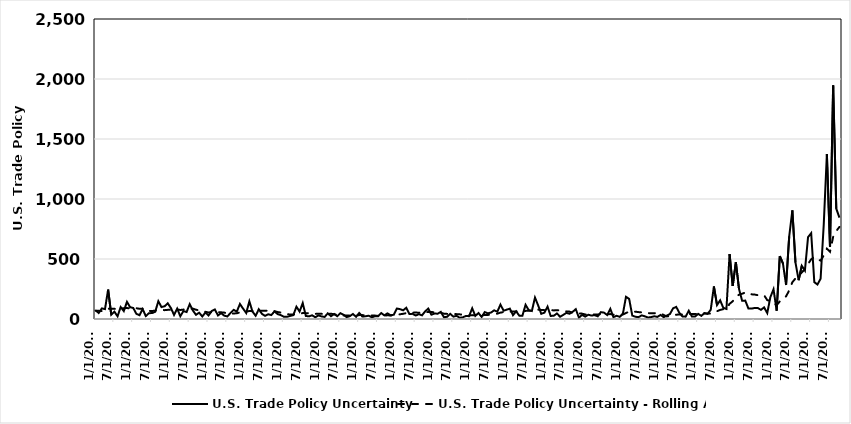
| Category | U.S. Trade Policy Uncertainty | U.S. Trade Policy Uncertainty - Rolling Avg. |
|---|---|---|
| 1/1/00 | 71.914 | 70.085 |
| 2/1/00 | 50.352 | 68.031 |
| 3/1/00 | 88.18 | 65.403 |
| 4/1/00 | 82.574 | 67.896 |
| 5/1/00 | 245.01 | 86.308 |
| 6/1/00 | 35.766 | 84.302 |
| 7/1/00 | 60.773 | 85.1 |
| 8/1/00 | 22.634 | 82.836 |
| 9/1/00 | 99.211 | 88.012 |
| 10/1/00 | 65.77 | 89.717 |
| 11/1/00 | 143.204 | 91.133 |
| 12/1/00 | 98.699 | 88.674 |
| 1/1/01 | 91.791 | 90.33 |
| 2/1/01 | 43.139 | 89.729 |
| 3/1/01 | 31.439 | 85.001 |
| 4/1/01 | 82.437 | 84.989 |
| 5/1/01 | 24.396 | 66.605 |
| 6/1/01 | 48.595 | 67.674 |
| 7/1/01 | 49.25 | 66.714 |
| 8/1/01 | 60.005 | 69.828 |
| 9/1/01 | 148.07 | 73.9 |
| 10/1/01 | 99.359 | 76.699 |
| 11/1/01 | 106.296 | 73.623 |
| 12/1/01 | 130.774 | 76.296 |
| 1/1/02 | 91.463 | 76.269 |
| 2/1/02 | 33.811 | 75.491 |
| 3/1/02 | 86.89 | 80.112 |
| 4/1/02 | 22.863 | 75.148 |
| 5/1/02 | 66.161 | 78.628 |
| 6/1/02 | 57.974 | 79.41 |
| 7/1/02 | 123.754 | 85.618 |
| 8/1/02 | 71.048 | 86.539 |
| 9/1/02 | 34.774 | 77.097 |
| 10/1/02 | 52.476 | 73.19 |
| 11/1/02 | 21.114 | 66.092 |
| 12/1/02 | 53.755 | 59.674 |
| 1/1/03 | 29.585 | 54.517 |
| 2/1/03 | 66.154 | 57.212 |
| 3/1/03 | 79.532 | 56.599 |
| 4/1/03 | 29.728 | 57.171 |
| 5/1/03 | 49.044 | 55.745 |
| 6/1/03 | 27.785 | 53.229 |
| 7/1/03 | 21.314 | 44.692 |
| 8/1/03 | 50.621 | 42.99 |
| 9/1/03 | 76.288 | 46.45 |
| 10/1/03 | 61.651 | 47.214 |
| 11/1/03 | 125.518 | 55.914 |
| 12/1/03 | 86.378 | 58.633 |
| 1/1/04 | 50.05 | 60.338 |
| 2/1/04 | 147.03 | 67.078 |
| 3/1/04 | 61.353 | 65.563 |
| 4/1/04 | 27.145 | 65.348 |
| 5/1/04 | 81.08 | 68.018 |
| 6/1/04 | 43.182 | 69.301 |
| 7/1/04 | 26.127 | 69.702 |
| 8/1/04 | 39.354 | 68.763 |
| 9/1/04 | 32.893 | 65.147 |
| 10/1/04 | 63.26 | 65.281 |
| 11/1/04 | 40.816 | 58.222 |
| 12/1/04 | 32.59 | 53.74 |
| 1/1/05 | 18.482 | 51.109 |
| 2/1/05 | 18.233 | 40.376 |
| 3/1/05 | 25.753 | 37.41 |
| 4/1/05 | 31.99 | 37.813 |
| 5/1/05 | 102.597 | 39.606 |
| 6/1/05 | 62.026 | 41.177 |
| 7/1/05 | 132.53 | 50.044 |
| 8/1/05 | 25.405 | 48.881 |
| 9/1/05 | 21.943 | 47.969 |
| 10/1/05 | 30.772 | 45.261 |
| 11/1/05 | 14.391 | 43.059 |
| 12/1/05 | 29.634 | 42.813 |
| 1/1/06 | 21.523 | 43.066 |
| 2/1/06 | 17.345 | 42.992 |
| 3/1/06 | 47.778 | 44.828 |
| 4/1/06 | 23.07 | 44.084 |
| 5/1/06 | 41.907 | 39.027 |
| 6/1/06 | 23.327 | 35.802 |
| 7/1/06 | 48.569 | 28.805 |
| 8/1/06 | 35.708 | 29.664 |
| 9/1/06 | 15.844 | 29.156 |
| 10/1/06 | 23.572 | 28.556 |
| 11/1/06 | 41.703 | 30.832 |
| 12/1/06 | 18.373 | 29.893 |
| 1/1/07 | 50.288 | 32.29 |
| 2/1/07 | 20.559 | 32.558 |
| 3/1/07 | 22.404 | 30.444 |
| 4/1/07 | 27.831 | 30.84 |
| 5/1/07 | 14.309 | 28.541 |
| 6/1/07 | 22.406 | 28.464 |
| 7/1/07 | 22.252 | 26.271 |
| 8/1/07 | 49.824 | 27.447 |
| 9/1/07 | 30.143 | 28.639 |
| 10/1/07 | 46.929 | 30.585 |
| 11/1/07 | 31.169 | 29.707 |
| 12/1/07 | 35.255 | 31.114 |
| 1/1/08 | 87.343 | 34.202 |
| 2/1/08 | 81.896 | 39.313 |
| 3/1/08 | 72.409 | 43.48 |
| 4/1/08 | 93.7 | 48.969 |
| 5/1/08 | 41.391 | 51.226 |
| 6/1/08 | 43.103 | 52.951 |
| 7/1/08 | 28.958 | 53.51 |
| 8/1/08 | 40.371 | 52.722 |
| 9/1/08 | 30.551 | 52.756 |
| 10/1/08 | 63.264 | 54.117 |
| 11/1/08 | 86.635 | 58.74 |
| 12/1/08 | 35.952 | 58.798 |
| 1/1/09 | 45.714 | 55.329 |
| 2/1/09 | 44.199 | 52.187 |
| 3/1/09 | 59.44 | 51.106 |
| 4/1/09 | 14.439 | 44.501 |
| 5/1/09 | 18.718 | 42.612 |
| 6/1/09 | 42.783 | 42.585 |
| 7/1/09 | 19.64 | 41.809 |
| 8/1/09 | 26.623 | 40.663 |
| 9/1/09 | 10.564 | 38.998 |
| 10/1/09 | 13.894 | 34.883 |
| 11/1/09 | 25.449 | 29.785 |
| 12/1/09 | 23.416 | 28.74 |
| 1/1/10 | 88.895 | 32.338 |
| 2/1/10 | 25.569 | 30.786 |
| 3/1/10 | 49.983 | 29.998 |
| 4/1/10 | 17.376 | 30.243 |
| 5/1/10 | 57.623 | 33.485 |
| 6/1/10 | 47.27 | 33.859 |
| 7/1/10 | 53.776 | 36.703 |
| 8/1/10 | 72.222 | 40.503 |
| 9/1/10 | 60.649 | 44.677 |
| 10/1/10 | 119.903 | 53.511 |
| 11/1/10 | 69.207 | 57.157 |
| 12/1/10 | 77.957 | 61.703 |
| 1/1/11 | 86.635 | 61.514 |
| 2/1/11 | 31.932 | 62.044 |
| 3/1/11 | 64.001 | 63.213 |
| 4/1/11 | 27.715 | 64.074 |
| 5/1/11 | 27.715 | 61.582 |
| 6/1/11 | 118.549 | 67.522 |
| 7/1/11 | 74.266 | 69.229 |
| 8/1/11 | 66.371 | 68.742 |
| 9/1/11 | 178.588 | 78.57 |
| 10/1/11 | 113.823 | 78.063 |
| 11/1/11 | 43.317 | 75.906 |
| 12/1/11 | 52.832 | 73.812 |
| 1/1/12 | 102.961 | 75.172 |
| 2/1/12 | 25.403 | 74.628 |
| 3/1/12 | 27.314 | 71.571 |
| 4/1/12 | 46.408 | 73.129 |
| 5/1/12 | 18.787 | 72.385 |
| 6/1/12 | 34.211 | 65.357 |
| 7/1/12 | 50.939 | 63.413 |
| 8/1/12 | 43.686 | 61.523 |
| 9/1/12 | 59.662 | 51.612 |
| 10/1/12 | 82.022 | 48.962 |
| 11/1/12 | 11.236 | 46.289 |
| 12/1/12 | 34.212 | 44.737 |
| 1/1/13 | 20.046 | 37.827 |
| 2/1/13 | 35.527 | 38.671 |
| 3/1/13 | 28.562 | 38.775 |
| 4/1/13 | 32.311 | 37.6 |
| 5/1/13 | 22.428 | 37.904 |
| 6/1/13 | 57.179 | 39.818 |
| 7/1/13 | 52.832 | 39.975 |
| 8/1/13 | 33.213 | 39.103 |
| 9/1/13 | 84.692 | 41.188 |
| 10/1/13 | 15.591 | 35.653 |
| 11/1/13 | 26.843 | 36.953 |
| 12/1/13 | 17.872 | 35.591 |
| 1/1/14 | 42.482 | 37.461 |
| 2/1/14 | 185.268 | 49.939 |
| 3/1/14 | 167.873 | 61.549 |
| 4/1/14 | 28.513 | 61.232 |
| 5/1/14 | 18.718 | 60.923 |
| 6/1/14 | 15.211 | 57.426 |
| 7/1/14 | 30.181 | 55.538 |
| 8/1/14 | 22.495 | 54.645 |
| 9/1/14 | 12.235 | 48.607 |
| 10/1/14 | 15.874 | 48.63 |
| 11/1/14 | 22.608 | 48.278 |
| 12/1/14 | 17.736 | 48.266 |
| 1/1/15 | 33.808 | 47.543 |
| 2/1/15 | 15.411 | 33.389 |
| 3/1/15 | 27.908 | 21.725 |
| 4/1/15 | 41.6 | 22.815 |
| 5/1/15 | 88.92 | 28.666 |
| 6/1/15 | 100.803 | 35.798 |
| 7/1/15 | 51.493 | 37.574 |
| 8/1/15 | 20.83 | 37.435 |
| 9/1/15 | 19.61 | 38.05 |
| 10/1/15 | 68.609 | 42.445 |
| 11/1/15 | 20.503 | 42.269 |
| 12/1/15 | 20.476 | 42.497 |
| 1/1/16 | 42.781 | 43.245 |
| 2/1/16 | 26.272 | 44.15 |
| 3/1/16 | 49.188 | 45.924 |
| 4/1/16 | 42.923 | 46.034 |
| 5/1/16 | 76.848 | 45.028 |
| 6/1/16 | 271.072 | 59.217 |
| 7/1/16 | 116.303 | 64.618 |
| 8/1/16 | 155.274 | 75.822 |
| 9/1/16 | 93.079 | 81.944 |
| 10/1/16 | 83.538 | 83.188 |
| 11/1/16 | 540.419 | 126.515 |
| 12/1/16 | 275.12 | 147.735 |
| 1/1/17 | 474.803 | 183.737 |
| 2/1/17 | 250.133 | 202.392 |
| 3/1/17 | 151.943 | 210.955 |
| 4/1/17 | 153.35 | 220.157 |
| 5/1/17 | 87.268 | 221.025 |
| 6/1/17 | 86.858 | 205.674 |
| 7/1/17 | 92.143 | 203.661 |
| 8/1/17 | 91.351 | 198.334 |
| 9/1/17 | 76.291 | 196.935 |
| 10/1/17 | 96.873 | 198.046 |
| 11/1/17 | 49.481 | 157.135 |
| 12/1/17 | 182.3 | 149.4 |
| 1/1/18 | 247.787 | 130.482 |
| 2/1/18 | 69.095 | 115.395 |
| 3/1/18 | 524.652 | 146.454 |
| 4/1/18 | 463.181 | 172.273 |
| 5/1/18 | 283.084 | 188.591 |
| 6/1/18 | 688.4 | 238.72 |
| 7/1/18 | 904.719 | 306.434 |
| 8/1/18 | 469.293 | 337.93 |
| 9/1/18 | 323.391 | 358.521 |
| 10/1/18 | 443.23 | 387.384 |
| 11/1/18 | 403.078 | 416.851 |
| 12/1/18 | 681.872 | 458.482 |
| 1/1/19 | 715.62 | 497.468 |
| 2/1/19 | 307.093 | 517.301 |
| 3/1/19 | 287.665 | 497.552 |
| 4/1/19 | 335.675 | 486.927 |
| 5/1/19 | 786.542 | 528.881 |
| 6/1/19 | 1374.28 | 586.038 |
| 7/1/19 | 600.788 | 560.711 |
| 8/1/19 | 1946.683 | 683.826 |
| 9/1/19 | 919.115 | 733.47 |
| 10/1/19 | 845.437 | 766.987 |